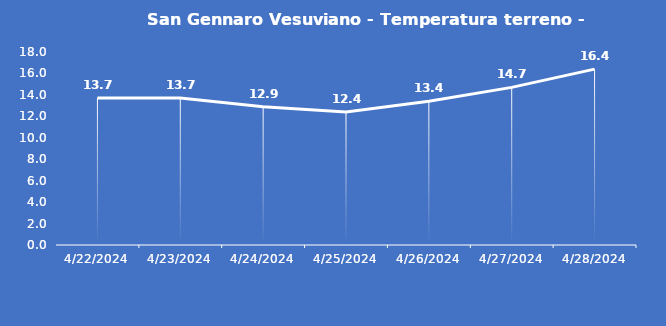
| Category | San Gennaro Vesuviano - Temperatura terreno - Grezzo (°C) |
|---|---|
| 4/22/24 | 13.7 |
| 4/23/24 | 13.7 |
| 4/24/24 | 12.9 |
| 4/25/24 | 12.4 |
| 4/26/24 | 13.4 |
| 4/27/24 | 14.7 |
| 4/28/24 | 16.4 |